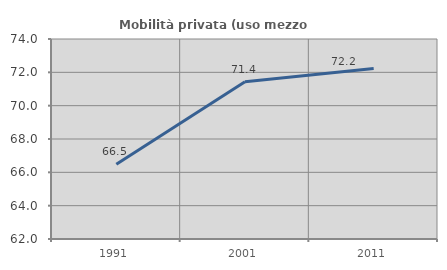
| Category | Mobilità privata (uso mezzo privato) |
|---|---|
| 1991.0 | 66.491 |
| 2001.0 | 71.439 |
| 2011.0 | 72.23 |